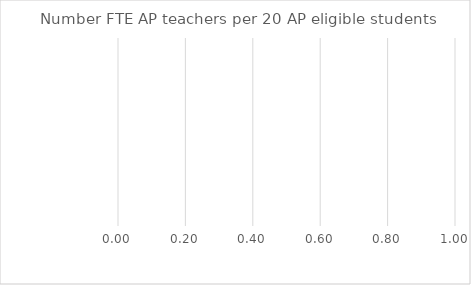
| Category | Benchmark | Entire LEA  | Title IV-A Identified Schools |
|---|---|---|---|
| Number FTE AP teachers per 20 AP eligible students | 0 | 0 | 0 |